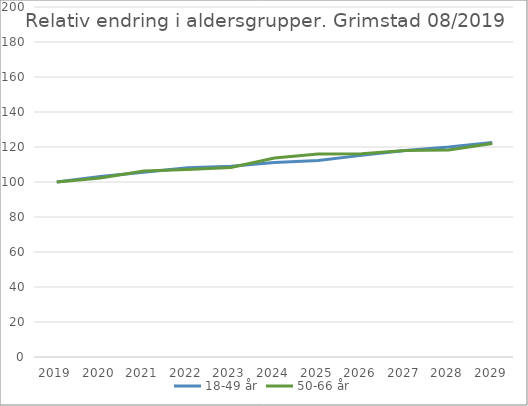
| Category | 18-49 år | 50-66 år |
|---|---|---|
| 2019 | 100 | 100 |
| 2020 | 103.181 | 102.29 |
| 2021 | 105.51 | 106.248 |
| 2022 | 108.191 | 107.106 |
| 2023 | 109.043 | 108.32 |
| 2024 | 111.205 | 113.651 |
| 2025 | 112.348 | 115.976 |
| 2026 | 115.213 | 116.13 |
| 2027 | 118.044 | 118.059 |
| 2028 | 119.982 | 118.245 |
| 2029 | 122.526 | 121.972 |